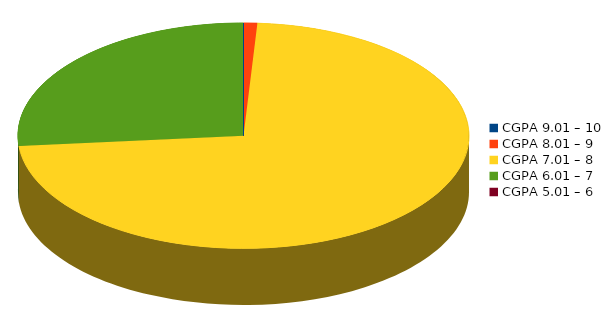
| Category | Number of students |
|---|---|
| CGPA 9.01 – 10 | 0 |
| CGPA 8.01 – 9 | 1 |
| CGPA 7.01 – 8 | 74 |
| CGPA 6.01 – 7 | 27 |
| CGPA 5.01 – 6 | 0 |